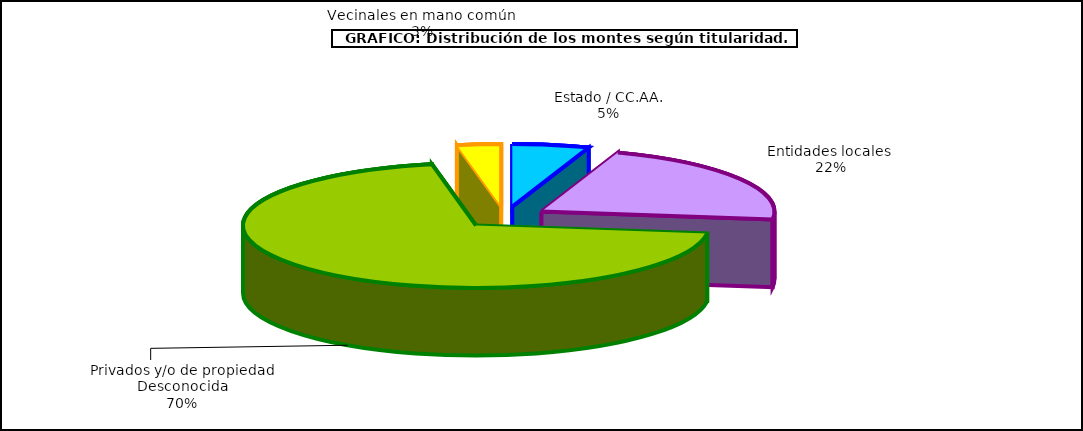
| Category | Series 0 |
|---|---|
| Estado / CC.AA. | 1470648.108 |
| Entidades locales  | 6005865.963 |
| Privados y/o de propiedad Desconocida | 19345594.716 |
| Vecinales en mano común  | 840754.683 |